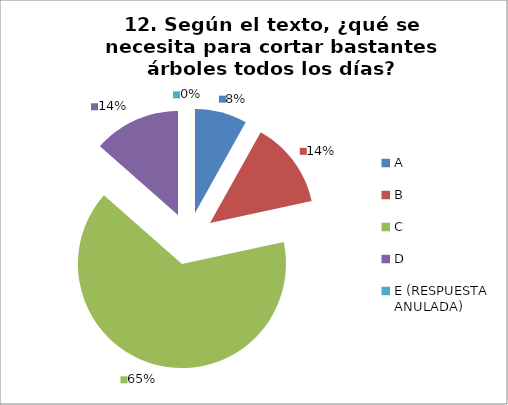
| Category | CANTIDAD DE RESPUESTAS PREGUNTA (12) | PORCENTAJE |
|---|---|---|
| A | 3 | 0.081 |
| B | 5 | 0.135 |
| C | 24 | 0.649 |
| D | 5 | 0.135 |
| E (RESPUESTA ANULADA) | 0 | 0 |